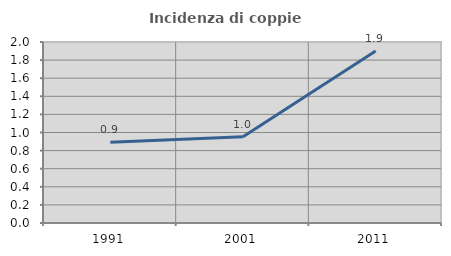
| Category | Incidenza di coppie miste |
|---|---|
| 1991.0 | 0.893 |
| 2001.0 | 0.952 |
| 2011.0 | 1.901 |